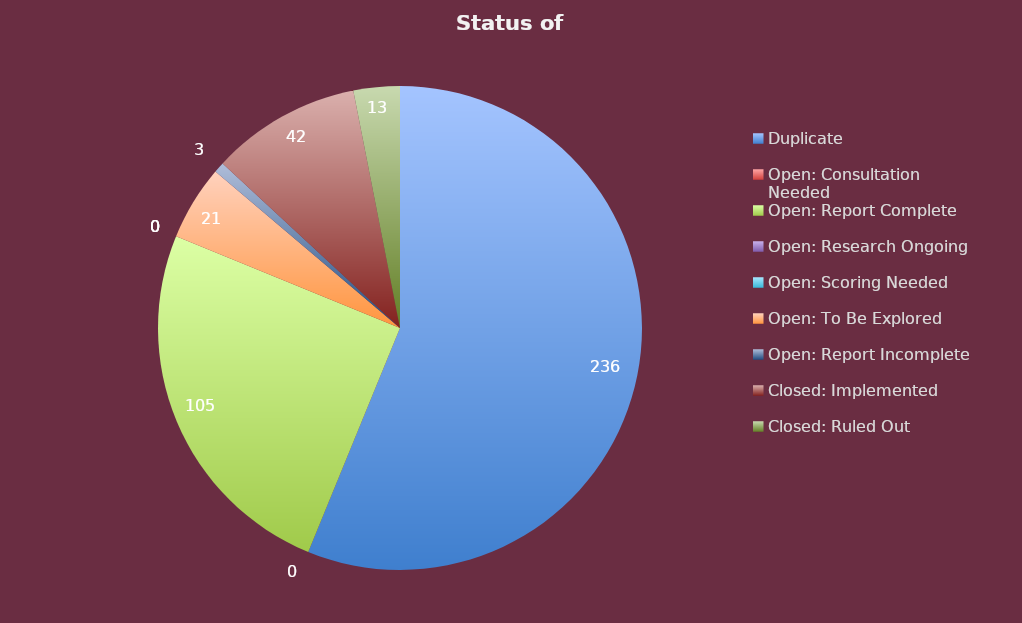
| Category | Total |
|---|---|
| Duplicate | 236 |
| Open: Consultation Needed | 0 |
| Open: Report Complete | 105 |
| Open: Research Ongoing | 0 |
| Open: Scoring Needed | 0 |
| Open: To Be Explored | 21 |
| Open: Report Incomplete | 3 |
| Closed: Implemented | 42 |
| Closed: Ruled Out | 13 |